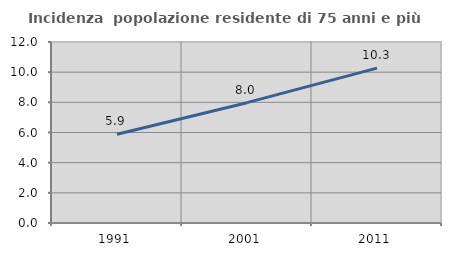
| Category | Incidenza  popolazione residente di 75 anni e più |
|---|---|
| 1991.0 | 5.882 |
| 2001.0 | 7.978 |
| 2011.0 | 10.269 |